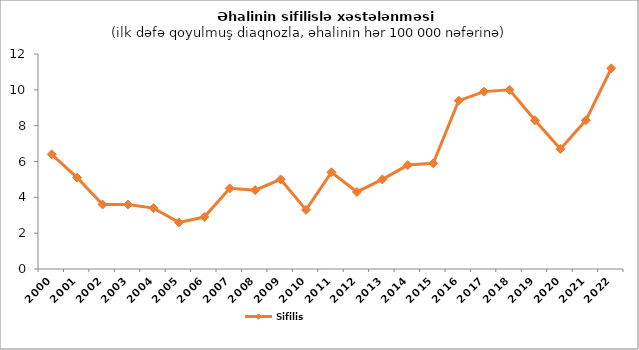
| Category | Sifilis                                                                                      |
|---|---|
| 2000.0 | 6.4 |
| 2001.0 | 5.1 |
| 2002.0 | 3.6 |
| 2003.0 | 3.6 |
| 2004.0 | 3.4 |
| 2005.0 | 2.6 |
| 2006.0 | 2.9 |
| 2007.0 | 4.5 |
| 2008.0 | 4.4 |
| 2009.0 | 5 |
| 2010.0 | 3.3 |
| 2011.0 | 5.4 |
| 2012.0 | 4.3 |
| 2013.0 | 5 |
| 2014.0 | 5.8 |
| 2015.0 | 5.9 |
| 2016.0 | 9.4 |
| 2017.0 | 9.9 |
| 2018.0 | 10 |
| 2019.0 | 8.3 |
| 2020.0 | 6.7 |
| 2021.0 | 8.3 |
| 2022.0 | 11.2 |